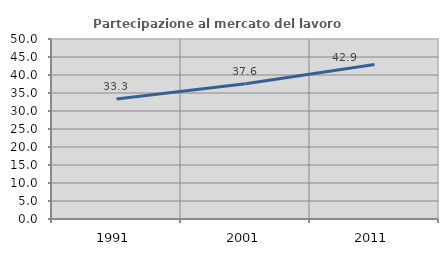
| Category | Partecipazione al mercato del lavoro  femminile |
|---|---|
| 1991.0 | 33.333 |
| 2001.0 | 37.569 |
| 2011.0 | 42.935 |